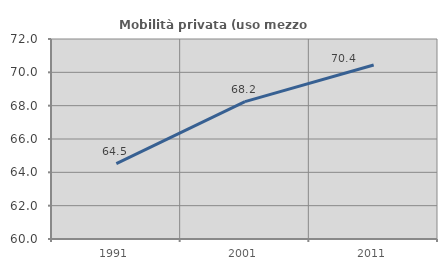
| Category | Mobilità privata (uso mezzo privato) |
|---|---|
| 1991.0 | 64.528 |
| 2001.0 | 68.243 |
| 2011.0 | 70.437 |